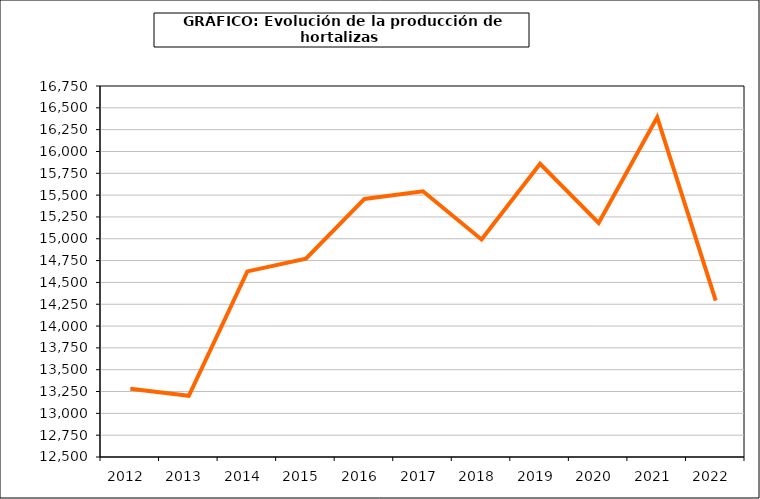
| Category | producción |
|---|---|
| 2012.0 | 13282.939 |
| 2013.0 | 13201.085 |
| 2014.0 | 14626.126 |
| 2015.0 | 14772.496 |
| 2016.0 | 15456.102 |
| 2017.0 | 15544.603 |
| 2018.0 | 14992.109 |
| 2019.0 | 15857.731 |
| 2020.0 | 15180.448 |
| 2021.0 | 16392.999 |
| 2022.0 | 14290.286 |